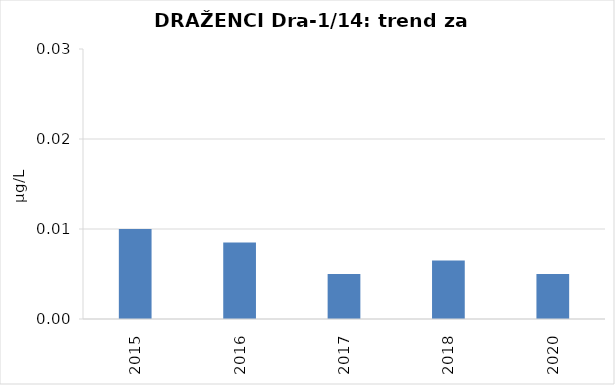
| Category | Vsota |
|---|---|
| 2015 | 0.01 |
| 2016 | 0.008 |
| 2017 | 0.005 |
| 2018 | 0.007 |
| 2020 | 0.005 |